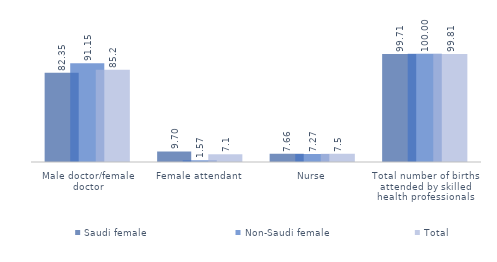
| Category | Saudi female  | Non-Saudi female | Total |
|---|---|---|---|
| Male doctor/female doctor | 82.353 | 91.152 | 85.202 |
| Female attendant | 9.701 | 1.575 | 7.07 |
| Nurse | 7.659 | 7.274 | 7.534 |
| Total number of births attended by skilled health professionals | 99.713 | 100 | 99.806 |